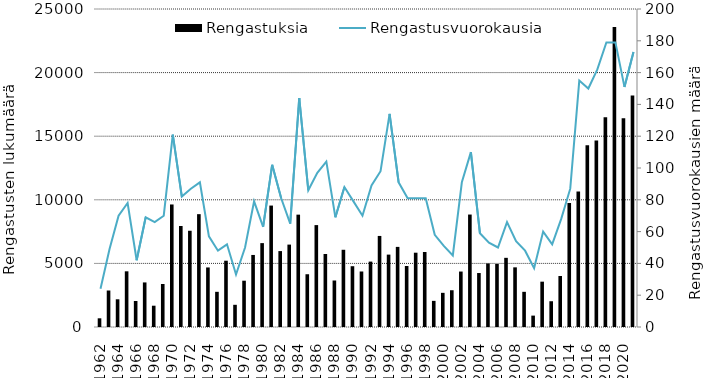
| Category | Rengastuksia |
|---|---|
| 1962.0 | 684 |
| 1963.0 | 2869 |
| 1964.0 | 2178 |
| 1965.0 | 4378 |
| 1966.0 | 2044 |
| 1967.0 | 3504 |
| 1968.0 | 1674 |
| 1969.0 | 3382 |
| 1970.0 | 9633 |
| 1971.0 | 7939 |
| 1972.0 | 7566 |
| 1973.0 | 8871 |
| 1974.0 | 4682 |
| 1975.0 | 2766 |
| 1976.0 | 5211 |
| 1977.0 | 1745 |
| 1978.0 | 3640 |
| 1979.0 | 5664 |
| 1980.0 | 6594 |
| 1981.0 | 9547 |
| 1982.0 | 5968 |
| 1983.0 | 6478 |
| 1984.0 | 8833 |
| 1985.0 | 4148 |
| 1986.0 | 8011 |
| 1987.0 | 5740 |
| 1988.0 | 3656 |
| 1989.0 | 6071 |
| 1990.0 | 4779 |
| 1991.0 | 4364 |
| 1992.0 | 5142 |
| 1993.0 | 7159 |
| 1994.0 | 5691 |
| 1995.0 | 6298 |
| 1996.0 | 4795 |
| 1997.0 | 5841 |
| 1998.0 | 5895 |
| 1999.0 | 2055 |
| 2000.0 | 2686 |
| 2001.0 | 2890 |
| 2002.0 | 4360 |
| 2003.0 | 8841 |
| 2004.0 | 4243 |
| 2005.0 | 4994 |
| 2006.0 | 4958 |
| 2007.0 | 5438 |
| 2008.0 | 4690 |
| 2009.0 | 2766 |
| 2010.0 | 895 |
| 2011.0 | 3564 |
| 2012.0 | 2026 |
| 2013.0 | 4009 |
| 2014.0 | 9750 |
| 2015.0 | 10648 |
| 2016.0 | 14290 |
| 2017.0 | 14655 |
| 2018.0 | 16489 |
| 2019.0 | 23589 |
| 2020.0 | 16406 |
| 2021.0 | 18199 |